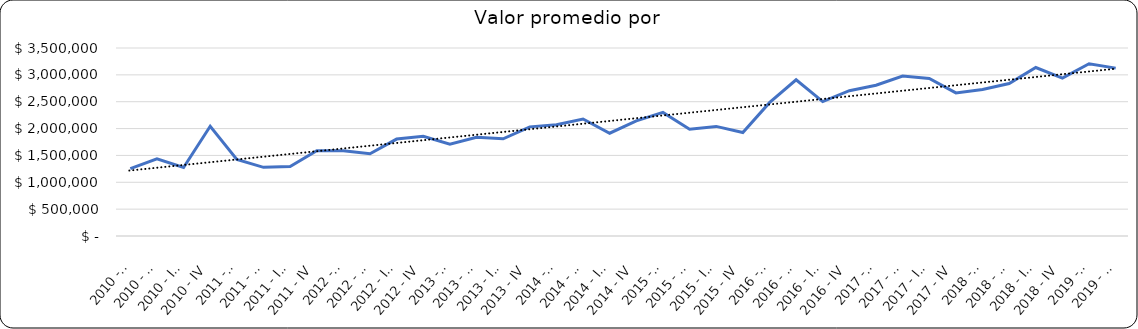
| Category | Valor m2 en Bogotá por sectores |
|---|---|
| 2010 - I | 1252873.563 |
| 2010 - II | 1436781.609 |
| 2010 - III | 1275287.356 |
| 2010 - IV | 2043103.448 |
| 2011 - I | 1425000 |
| 2011 - II | 1277777.778 |
| 2011 - III | 1291666.667 |
| 2011 - IV | 1586111.111 |
| 2012 - I | 1588793.103 |
| 2012 - II | 1531609.195 |
| 2012 - III | 1804597.701 |
| 2012 - IV | 1856321.839 |
| 2013 - I | 1709770.115 |
| 2013 - II | 1839080.46 |
| 2013 - III | 1810344.828 |
| 2013 - IV | 2031609.195 |
| 2014 - I | 2071428.571 |
| 2014 - II | 2178571.429 |
| 2014 - III | 1913690.476 |
| 2014 - IV | 2142857.143 |
| 2015 - I | 2301724.138 |
| 2015 - II | 1988505.747 |
| 2015 - III | 2040229.885 |
| 2015 - IV | 1925287.356 |
| 2016 - I | 2482456.14 |
| 2016 - II | 2908496.732 |
| 2016 - III | 2503144.654 |
| 2016 - IV | 2705357.143 |
| 2017 - I | 2807692.308 |
| 2017 - II | 2979495.268 |
| 2017 - III | 2933333.333 |
| 2017 - IV | 2663742.69 |
| 2018 - I | 2727272.727 |
| 2018 - II | 2838308.002 |
| 2018 - III | 3137255 |
| 2018 - IV | 2938296 |
| 2019 - I | 3207547 |
| 2019 - II | 3125000 |